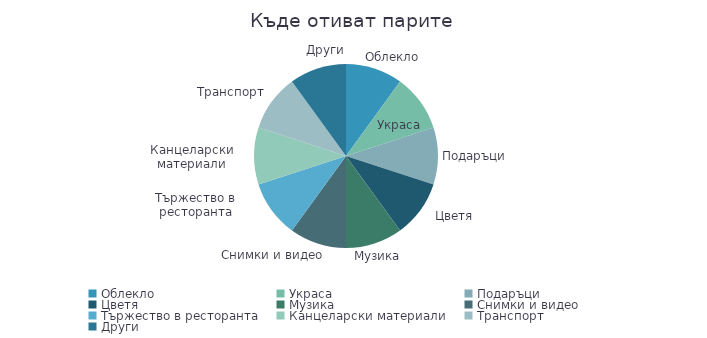
| Category | Сума |
|---|---|
| Облекло | 1 |
| Украса | 1 |
| Подаръци | 1 |
| Цветя | 1 |
| Музика | 1 |
| Снимки и видео | 1 |
| Тържество в ресторанта | 1 |
| Канцеларски материали | 1 |
| Транспорт | 1 |
| Други | 1 |